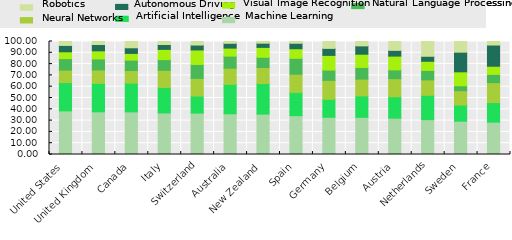
| Category | Machine Learning | Artificial Intelligence | Neural Networks | Natural Language Processing | Visual Image Recognition | Autonomous Driving | Robotics |
|---|---|---|---|---|---|---|---|
| United States | 38.6 | 25.056 | 11.038 | 10.135 | 6.076 | 5.624 | 3.471 |
| United Kingdom | 37.761 | 25.165 | 11.838 | 9.829 | 7.158 | 5.579 | 2.67 |
| Canada | 37.724 | 25.461 | 11.09 | 9.253 | 5.927 | 4.992 | 5.552 |
| Italy | 36.773 | 22.476 | 15.288 | 9.426 | 9.056 | 4.306 | 2.676 |
| Switzerland | 36.636 | 15.043 | 15.69 | 12.324 | 12.831 | 4.344 | 3.133 |
| Australia | 36.039 | 26.039 | 14.275 | 10.709 | 7.082 | 4.269 | 1.587 |
| New Zealand | 35.741 | 27.048 | 14.201 | 9.023 | 8.788 | 3.712 | 1.487 |
| Spain | 34.409 | 20.576 | 16.063 | 14.073 | 8.471 | 4.871 | 1.537 |
| Germany | 32.944 | 15.906 | 16.743 | 9.141 | 12.973 | 6.193 | 6.099 |
| Belgium | 32.888 | 18.966 | 14.837 | 10.332 | 11.734 | 7.374 | 3.87 |
| Austria | 32.164 | 18.916 | 16.008 | 7.809 | 12.169 | 5.106 | 7.829 |
| Netherlands | 30.857 | 21.502 | 13.666 | 8.395 | 8.079 | 4.426 | 13.075 |
| Sweden | 29.489 | 14.273 | 12.685 | 4.352 | 12.369 | 17.384 | 9.448 |
| France | 28.61 | 17.341 | 17.646 | 7.26 | 7.257 | 18.772 | 3.113 |